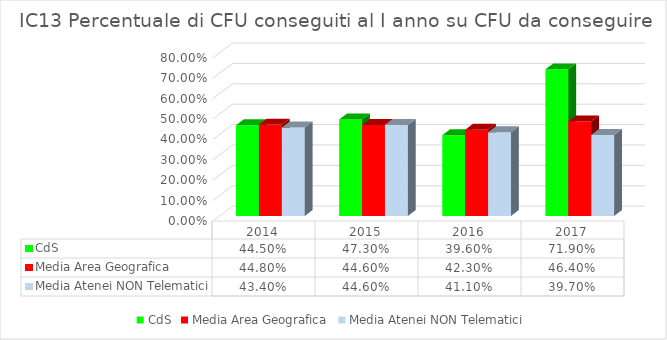
| Category | CdS | Media Area Geografica | Media Atenei NON Telematici |
|---|---|---|---|
| 2014.0 | 0.445 | 0.448 | 0.434 |
| 2015.0 | 0.473 | 0.446 | 0.446 |
| 2016.0 | 0.396 | 0.423 | 0.411 |
| 2017.0 | 0.719 | 0.464 | 0.397 |